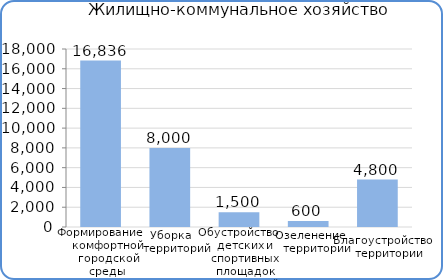
| Category | Расходы |
|---|---|
| Формирование комфортной городской среды | 16835800 |
| Уборка территорий | 8000000 |
| Обустройство детских и спортивных площадок | 1500000 |
| Озеленение территории | 600000 |
| Благоустройство территории | 4800000 |